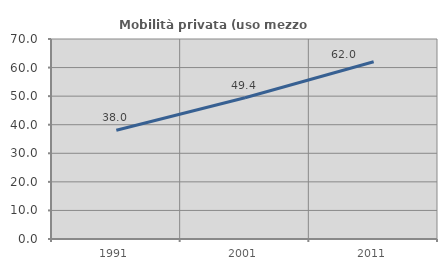
| Category | Mobilità privata (uso mezzo privato) |
|---|---|
| 1991.0 | 38.046 |
| 2001.0 | 49.418 |
| 2011.0 | 62.023 |